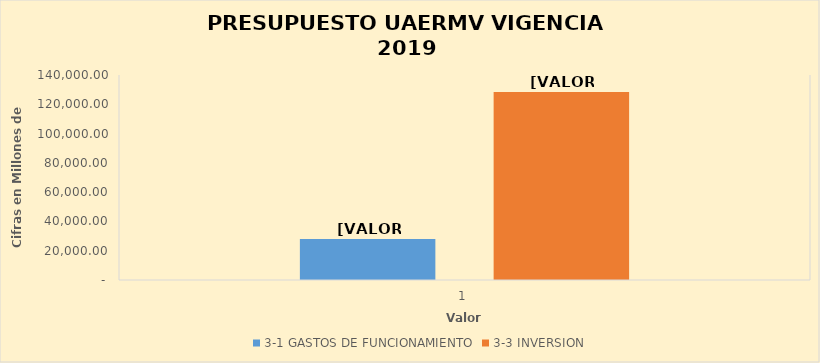
| Category | 3-1 | 3-3 |
|---|---|---|
| 0 | 28003.61 | 128393.394 |